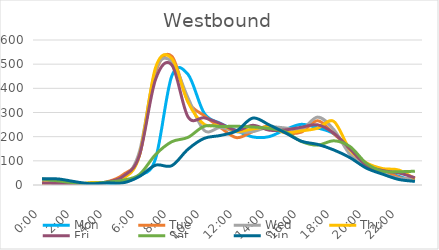
| Category | Mon | Tue | Wed | Thu | Fri | Sat | Sun |
|---|---|---|---|---|---|---|---|
| 0.0 | 12 | 6 | 15 | 9 | 8 | 25 | 26 |
| 0.041667 | 12 | 7 | 2 | 6 | 6 | 17 | 25 |
| 0.083333 | 2 | 1 | 1 | 1 | 6 | 9 | 14 |
| 0.125 | 3 | 5 | 4 | 10 | 2 | 7 | 5 |
| 0.166667 | 4 | 13 | 9 | 11 | 12 | 12 | 9 |
| 0.208333 | 12 | 43 | 27 | 27 | 36 | 20 | 9 |
| 0.25 | 38 | 123 | 137 | 121 | 122 | 43 | 35 |
| 0.291667 | 109 | 466 | 476 | 486 | 437 | 126 | 82 |
| 0.333333 | 451 | 533 | 511 | 523 | 497 | 179 | 80 |
| 0.375 | 458 | 346 | 361 | 343 | 282 | 197 | 148 |
| 0.416667 | 297 | 287 | 226 | 251 | 278 | 243 | 193 |
| 0.458333 | 255 | 238 | 238 | 249 | 254 | 242 | 205 |
| 0.5 | 225 | 196 | 220 | 222 | 226 | 243 | 224 |
| 0.541667 | 199 | 221 | 221 | 232 | 247 | 240 | 277 |
| 0.5833333333333334 | 200 | 244 | 240 | 239 | 227 | 234 | 249 |
| 0.625 | 229 | 216 | 236 | 217 | 228 | 220 | 216 |
| 0.666667 | 251 | 219 | 229 | 224 | 239 | 180 | 181 |
| 0.708333 | 236 | 266 | 281 | 235 | 249 | 165 | 168 |
| 0.75 | 212 | 212 | 229 | 263 | 214 | 183 | 145 |
| 0.791667 | 150 | 148 | 126 | 145 | 149 | 159 | 113 |
| 0.833333 | 77 | 82 | 86 | 92 | 82 | 90 | 70 |
| 0.875 | 61 | 63 | 48 | 68 | 60 | 57 | 45 |
| 0.916667 | 36 | 32 | 28 | 62 | 50 | 55 | 23 |
| 0.958333 | 16 | 20 | 28 | 26 | 30 | 57 | 15 |